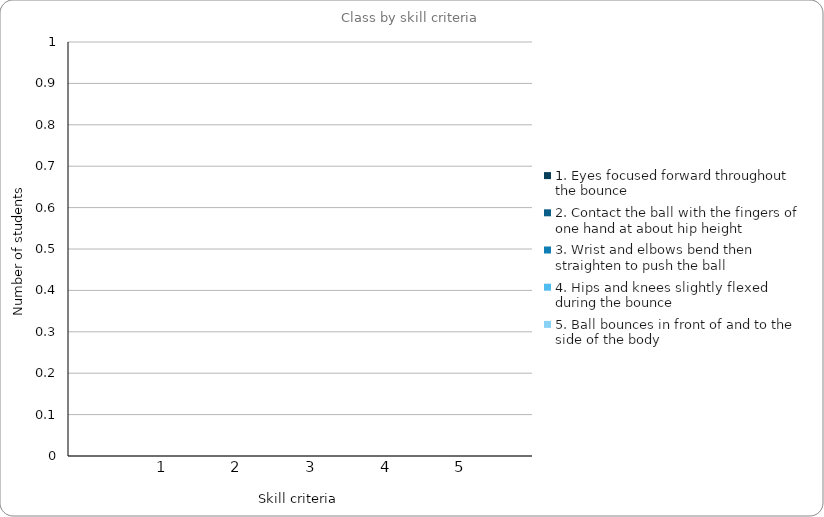
| Category | 1. Eyes focused forward throughout the bounce | 2. Contact the ball with the fingers of one hand at about hip height | 3. Wrist and elbows bend then straighten to push the ball | 4. Hips and knees slightly flexed during the bounce | 5. Ball bounces in front of and to the side of the body |
|---|---|---|---|---|---|
| 0 | 0 | 0 | 0 | 0 | 0 |